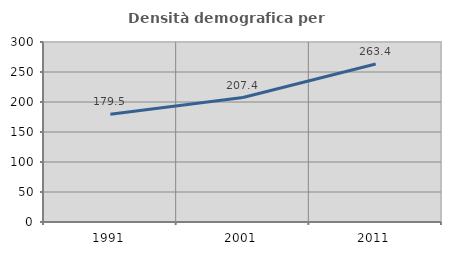
| Category | Densità demografica |
|---|---|
| 1991.0 | 179.47 |
| 2001.0 | 207.42 |
| 2011.0 | 263.422 |